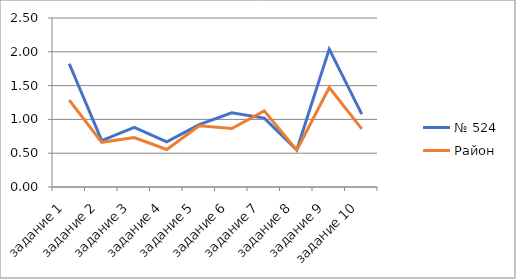
| Category | № 524 | Район |
|---|---|---|
| задание 1 | 1.824 | 1.284 |
| задание 2 | 0.686 | 0.661 |
| задание 3 | 0.882 | 0.733 |
| задание 4 | 0.667 | 0.555 |
| задание 5 | 0.922 | 0.906 |
| задание 6 | 1.098 | 0.865 |
| задание 7 | 1.02 | 1.127 |
| задание 8 | 0.549 | 0.543 |
| задание 9 | 2.039 | 1.472 |
| задание 10 | 1.078 | 0.859 |